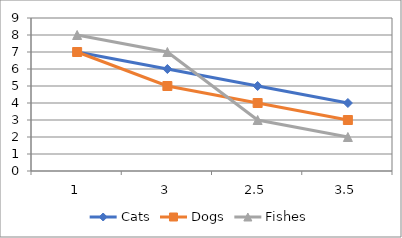
| Category | Cats | Dogs | Fishes |
|---|---|---|---|
| 1.0 | 7 | 7 | 8 |
| 3.0 | 6 | 5 | 7 |
| 2.5 | 5 | 4 | 3 |
| 3.5 | 4 | 3 | 2 |